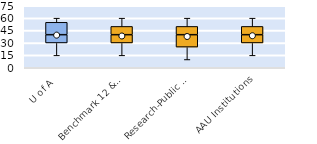
| Category | 25th | 50th | 75th |
|---|---|---|---|
| U of A | 30 | 10 | 15 |
| Benchmark 12 & SEC | 30 | 10 | 10 |
| Research-Public Univ | 25 | 15 | 10 |
| AAU Institutions | 30 | 10 | 10 |